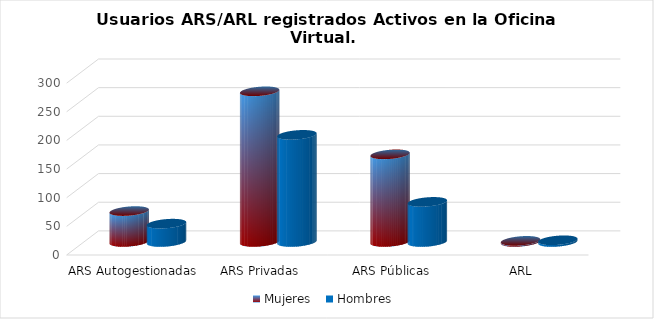
| Category | Mujeres | Hombres |
|---|---|---|
| ARS Autogestionadas | 54 | 32 |
| ARS Privadas | 263 | 187 |
| ARS Públicas | 153 | 70 |
| ARL | 2 | 3 |